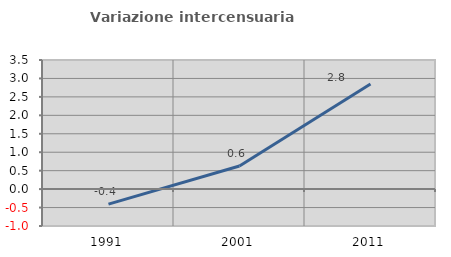
| Category | Variazione intercensuaria annua |
|---|---|
| 1991.0 | -0.405 |
| 2001.0 | 0.626 |
| 2011.0 | 2.848 |